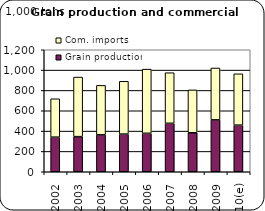
| Category | Grain production | Com. imports |
|---|---|---|
| 2002 | 340.369 | 377.549 |
| 2003 | 345.37 | 585.929 |
| 2004 | 363.035 | 486.615 |
| 2005 | 370.535 | 519.428 |
| 2006 | 378.37 | 631.029 |
| 2007 | 476.71 | 497.558 |
| 2008 | 383.37 | 421.771 |
| 2009 | 510.543 | 510.243 |
| 2010(e) | 458.511 | 504.949 |